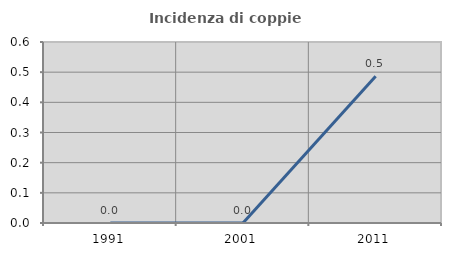
| Category | Incidenza di coppie miste |
|---|---|
| 1991.0 | 0 |
| 2001.0 | 0 |
| 2011.0 | 0.487 |